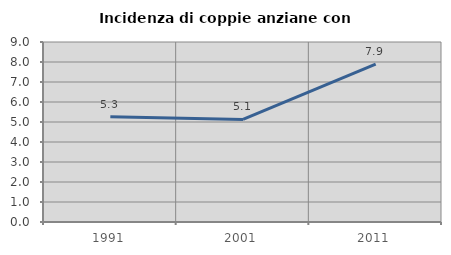
| Category | Incidenza di coppie anziane con figli |
|---|---|
| 1991.0 | 5.263 |
| 2001.0 | 5.128 |
| 2011.0 | 7.895 |